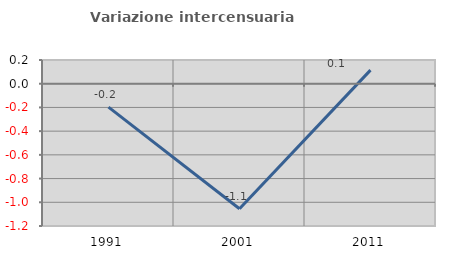
| Category | Variazione intercensuaria annua |
|---|---|
| 1991.0 | -0.197 |
| 2001.0 | -1.055 |
| 2011.0 | 0.114 |